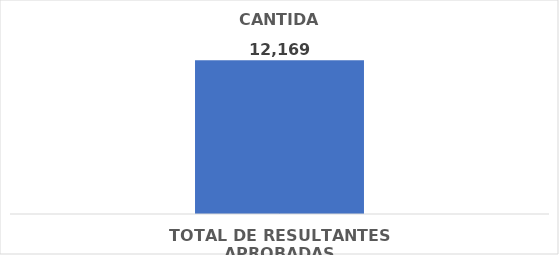
| Category | CANTIDAD |
|---|---|
| TOTAL DE RESULTANTES APROBADAS | 12169 |